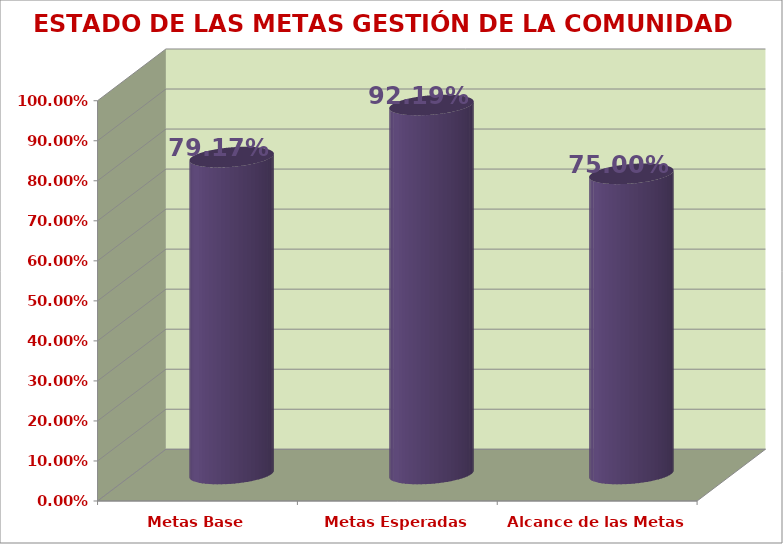
| Category | ESTADO DE LAS METAS GESTIÓN DE LA COMUNIDAD |
|---|---|
| Metas Base | 0.792 |
| Metas Esperadas | 0.922 |
| Alcance de las Metas | 0.75 |